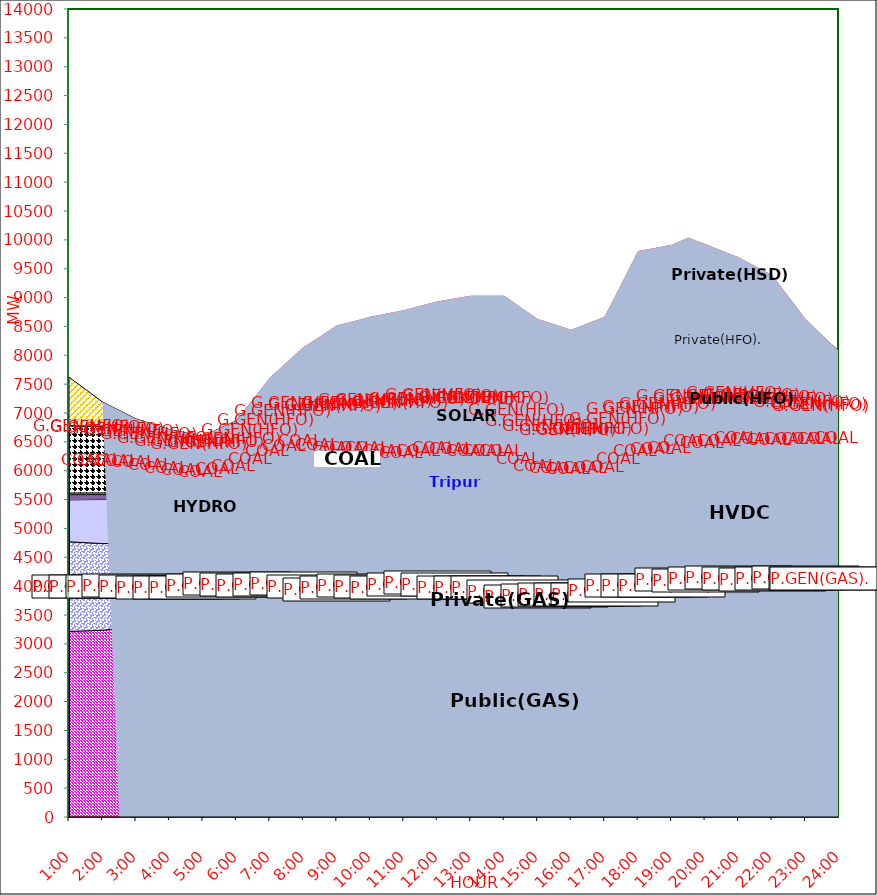
| Category | GAS | P.GEN(GAS). |  HVDC | TRIPURA | HYDRO | COAL | SOLAR | G.GEN(HFO) | P.GEN(HFO). | G.GEN(HSD) | P.GEN(HSD) | SHORTAGE | Total Energy Gen 201.414 MKWHr 
Energy Not Served   3.762 MKWHr 
Energy Requirement     205.176 MKWHr  |
|---|---|---|---|---|---|---|---|---|---|---|---|---|---|
| 1:00 | 3214 | 1555 | 725 | 90 | 30 | 1165 | 0 | 0 | 842 | 0 | 0 | 0 |  |
| 1:30 | 3224.5 | 1528.5 | 745 | 87 | 30 | 1160.5 | 0 | 0 | 630.5 | 0 | 0 | 0 |  |
| 2:00 | 3235 | 1502 | 765 | 84 | 30 | 1156 | 0 | 0 | 419 | 0 | 0 | 0 |  |
| 2:30 | 3266 | 1472.5 | 765 | 84 | 30 | 1121 | 0 | 0 | 306 | 0 | 0 | 0 |  |
| 3:00 | 3297 | 1443 | 765 | 84 | 30 | 1086 | 0 | 0 | 193 | 0 | 0 | 0 |  |
| 3:30 | 3294.5 | 1410 | 765 | 83 | 30 | 1061 | 0 | 0 | 162.5 | 0 | 0 | 0 |  |
| 4:00 | 3292 | 1377 | 765 | 82 | 30 | 1036 | 0 | 0 | 132 | 0 | 0 | 0 |  |
| 4:30 | 3289.5 | 1369.5 | 765 | 82 | 30 | 986.5 | 0 | 0 | 132 | 0 | 0 | 0 |  |
| 5:00 | 3287 | 1362 | 765 | 82 | 30 | 937 | 0 | 0 | 132 | 0 | 0 | 0 |  |
| 5:30 | 3320 | 1374 | 765 | 82 | 30 | 937 | 0 | 0 | 223 | 0 | 0 | 0 |  |
| 6:00 | 3353 | 1386 | 765 | 82 | 30 | 937 | 0 | 0 | 314 | 0 | 0 | 0 |  |
| 6:30 | 3287.5 | 1476 | 836 | 85 | 30 | 1001.5 | 1.5 | 8 | 496.5 | 0 | 0 | 16.128 |  |
| 7:00 | 3222 | 1566 | 907 | 88 | 30 | 1066 | 3 | 16 | 679 | 0 | 0 | 32.255 |  |
| 7:30 | 3214 | 1631 | 907 | 89 | 30 | 1127.5 | 27 | 24 | 738 | 0 | 0 | 86.167 |  |
| 8:00 | 3206 | 1696 | 907 | 90 | 30 | 1189 | 51 | 32 | 797 | 0 | 0 | 140.079 |  |
| 8:30 | 3156 | 1691.5 | 907 | 93 | 30 | 1162.5 | 92.5 | 43.5 | 874.5 | 0 | 0 | 276.012 |  |
| 9:00 | 3106 | 1687 | 907 | 96 | 30 | 1136 | 134 | 55 | 952 | 0 | 0 | 411.944 |  |
| 9:30 | 3146 | 1667 | 906.5 | 95 | 30 | 1106.5 | 187.5 | 84 | 967.5 | 0 | 0 | 400.885 |  |
| 10:00 | 3186 | 1647 | 906 | 94 | 30 | 1077 | 241 | 113 | 983 | 0 | 0 | 389.826 |  |
| 10:30 | 3187 | 1618.5 | 906 | 99 | 30 | 1031 | 271.5 | 138.5 | 1016 | 126 | 0 | 300.894 |  |
| 11:00 | 3188 | 1590 | 906 | 104 | 30 | 985 | 302 | 164 | 1049 | 252 | 0 | 211.962 |  |
| 11:30 | 3224.5 | 1598.5 | 906 | 106 | 30 | 985 | 313.5 | 186.5 | 1051 | 248 | 0 | 208.276 |  |
| 12:00 | 3261 | 1607 | 906 | 108 | 30 | 985 | 325 | 209 | 1053 | 244 | 0 | 204.59 |  |
| 12:30 | 3207 | 1627.5 | 906 | 110 | 30 | 993.5 | 317.5 | 208.5 | 1062 | 246 | 0 | 274.169 |  |
| 13:00 | 3153 | 1648 | 906 | 112 | 30 | 1002 | 310 | 208 | 1071 | 248 | 0 | 343.747 |  |
| 13:30 | 3153 | 1648 | 906 | 112 | 30 | 1002 | 310 | 208 | 1071 | 248 | 0 | 343.747 |  |
| 14:00 | 3153 | 1648 | 906 | 112 | 30 | 1002 | 310 | 208 | 1071 | 248 | 0 | 343.747 |  |
| 14:30 | 3115.5 | 1574.5 | 905 | 109 | 30 | 968 | 248 | 228.5 | 1103 | 249.5 | 0 | 299.051 |  |
| 15:00 | 3078 | 1501 | 904 | 106 | 30 | 934 | 186 | 249 | 1135 | 251 | 0 | 254.355 |  |
| 15:30 | 3092 | 1493 | 904 | 75 | 30 | 933.5 | 136.5 | 248.5 | 1210 | 249 | 0 | 164.501 |  |
| 16:00 | 3106 | 1485 | 904 | 44 | 30 | 933 | 87 | 248 | 1285 | 247 | 0 | 74.648 |  |
| 16:30 | 3109.5 | 1480.5 | 904.5 | 62 | 30 | 933 | 53.5 | 303.5 | 1364.5 | 250.5 | 0 | 63.128 |  |
| 17:00 | 3113 | 1476 | 905 | 80 | 30 | 933 | 20 | 359 | 1444 | 254 | 0 | 51.608 |  |
| 17:30 | 3146 | 1573.5 | 904.5 | 90 | 30 | 933 | 10 | 434 | 1574 | 252.5 | 0 | 287.992 |  |
| 18:00 | 3179 | 1671 | 904 | 100 | 30 | 933 | 0 | 509 | 1704 | 251 | 0 | 524.376 |  |
| 18:30 | 3175.5 | 1680 | 904.5 | 104 | 30 | 967.5 | 0 | 508.5 | 1769 | 252 | 0 | 469.188 |  |
| 19:00 | 3172 | 1689 | 905 | 108 | 30 | 1002 | 0 | 508 | 1834 | 253 | 0 | 414 |  |
| 19:30 | 3258 | 1705 | 904 | 108 | 30 | 1034 | 0 | 524 | 1857 | 253 | 0 | 361.5 |  |
| 20:00 | 3257 | 1677 | 904 | 102 | 30 | 1033 | 0 | 512 | 1852 | 253 | 0 | 309 |  |
| 20:30 | 3279.5 | 1689.5 | 904 | 107 | 30 | 1037.5 | 0 | 511.5 | 1776.5 | 254 | 0 | 223.5 |  |
| 21:00 | 3302 | 1702 | 904 | 112 | 30 | 1042 | 0 | 511 | 1701 | 255 | 0 | 138 |  |
| 21:30 | 3280 | 1710.5 | 904.5 | 113 | 30 | 1042 | 0 | 478 | 1671.5 | 222.5 | 0 | 91.5 |  |
| 22:00 | 3258 | 1719 | 905 | 114 | 30 | 1042 | 0 | 445 | 1642 | 190 | 0 | 45 |  |
| 22:30 | 3277 | 1710 | 905 | 111 | 30 | 1041.5 | 0 | 339 | 1462.5 | 95 | 0 | 37.5 |  |
| 23:00 | 3296 | 1701 | 905 | 108 | 30 | 1041 | 0 | 233 | 1283 | 0 | 0 | 30 |  |
| 23:30 | 3289 | 1702.5 | 904 | 101 | 30 | 1075.5 | 0 | 116.5 | 1115 | 0 | 0 | 15 |  |
| 24:00 | 3282 | 1704 | 903 | 94 | 30 | 1110 | 0 | 0 | 947 | 0 | 0 | 0 |  |